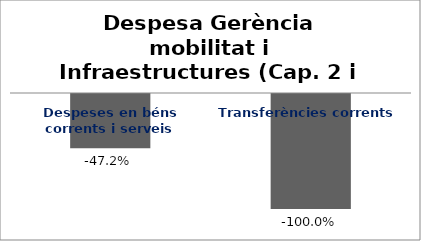
| Category | Series 0 |
|---|---|
| Despeses en béns corrents i serveis | -0.472 |
| Transferències corrents | -1 |